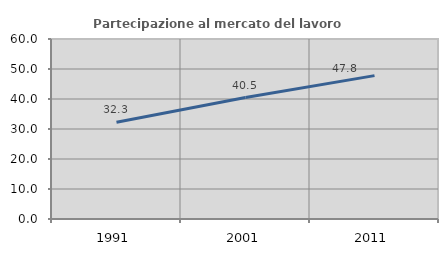
| Category | Partecipazione al mercato del lavoro  femminile |
|---|---|
| 1991.0 | 32.265 |
| 2001.0 | 40.494 |
| 2011.0 | 47.792 |